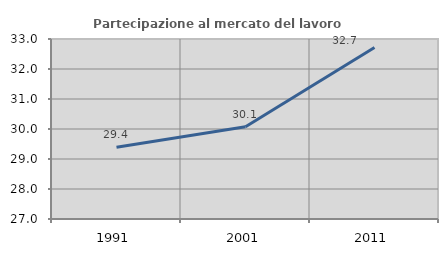
| Category | Partecipazione al mercato del lavoro  femminile |
|---|---|
| 1991.0 | 29.388 |
| 2001.0 | 30.077 |
| 2011.0 | 32.714 |